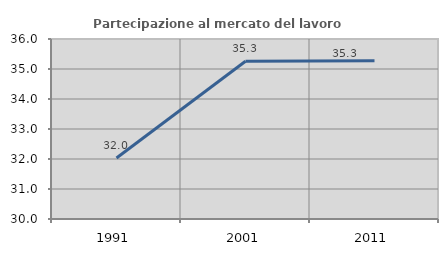
| Category | Partecipazione al mercato del lavoro  femminile |
|---|---|
| 1991.0 | 32.032 |
| 2001.0 | 35.256 |
| 2011.0 | 35.272 |